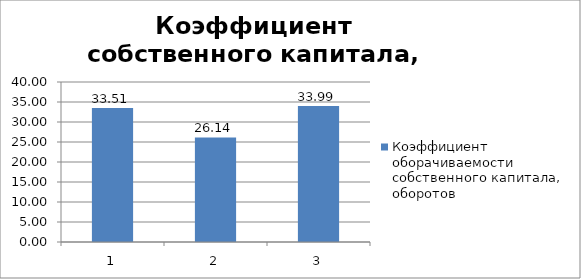
| Category | Коэффициент оборачиваемости собственного капитала, оборотов |
|---|---|
| 0 | 33.507 |
| 1 | 26.14 |
| 2 | 33.995 |